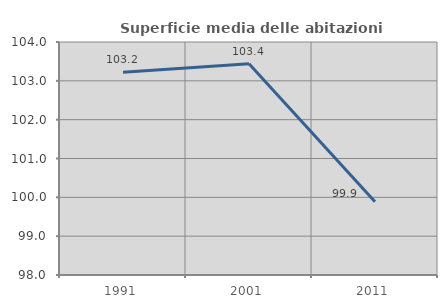
| Category | Superficie media delle abitazioni occupate |
|---|---|
| 1991.0 | 103.22 |
| 2001.0 | 103.439 |
| 2011.0 | 99.887 |